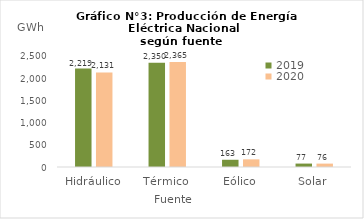
| Category | 2019 | 2020 |
|---|---|---|
| Hidráulico | 2218.756 | 2130.978 |
| Térmico | 2350.1 | 2365.385 |
| Eólico | 162.893 | 172.173 |
| Solar | 77.096 | 76.338 |